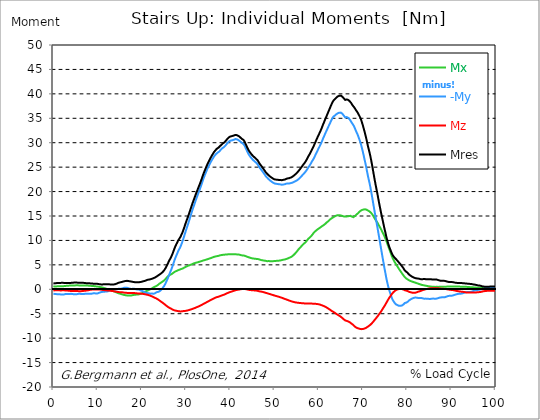
| Category |  Mx |  -My |  Mz |  Mres |
|---|---|---|---|---|
| 0.0 | 0.56 | -0.91 | -0.23 | 1.18 |
| 0.16678370786516855 | 0.56 | -0.93 | -0.23 | 1.21 |
| 0.3335674157303371 | 0.57 | -0.96 | -0.22 | 1.23 |
| 0.5003511235955057 | 0.58 | -0.97 | -0.21 | 1.25 |
| 0.6671348314606742 | 0.59 | -0.99 | -0.21 | 1.26 |
| 0.8339185393258427 | 0.6 | -1 | -0.21 | 1.27 |
| 1.0007022471910114 | 0.61 | -1 | -0.21 | 1.27 |
| 1.1674859550561796 | 0.62 | -1 | -0.22 | 1.28 |
| 1.3342696629213484 | 0.62 | -1.02 | -0.22 | 1.28 |
| 1.5010533707865168 | 0.62 | -1.04 | -0.23 | 1.3 |
| 1.6678370786516854 | 0.62 | -1.05 | -0.23 | 1.31 |
| 1.8346207865168538 | 0.62 | -1.07 | -0.23 | 1.32 |
| 2.001404494382023 | 0.63 | -1.07 | -0.22 | 1.32 |
| 2.1681882022471908 | 0.63 | -1.07 | -0.21 | 1.32 |
| 2.334971910112359 | 0.64 | -1.06 | -0.21 | 1.31 |
| 2.501755617977528 | 0.66 | -1.03 | -0.22 | 1.29 |
| 2.668539325842697 | 0.68 | -0.99 | -0.23 | 1.27 |
| 2.8353230337078656 | 0.69 | -0.97 | -0.25 | 1.27 |
| 3.0021067415730336 | 0.71 | -0.99 | -0.26 | 1.29 |
| 3.168890449438202 | 0.72 | -1 | -0.27 | 1.31 |
| 3.335674157303371 | 0.73 | -0.99 | -0.28 | 1.31 |
| 3.502457865168539 | 0.75 | -0.97 | -0.29 | 1.31 |
| 3.6692415730337076 | 0.76 | -0.96 | -0.31 | 1.31 |
| 3.8360252808988764 | 0.77 | -0.94 | -0.33 | 1.3 |
| 4.002808988764046 | 0.78 | -0.93 | -0.35 | 1.31 |
| 4.169592696629214 | 0.79 | -0.94 | -0.36 | 1.32 |
| 4.3363764044943816 | 0.79 | -0.97 | -0.36 | 1.34 |
| 4.50316011235955 | 0.8 | -1 | -0.36 | 1.36 |
| 4.669943820224718 | 0.8 | -1.02 | -0.36 | 1.37 |
| 4.836727528089888 | 0.79 | -1.03 | -0.36 | 1.38 |
| 5.003511235955056 | 0.8 | -1.03 | -0.35 | 1.38 |
| 5.170294943820225 | 0.81 | -1.02 | -0.35 | 1.38 |
| 5.337078651685394 | 0.81 | -1 | -0.36 | 1.37 |
| 5.5038623595505625 | 0.81 | -0.97 | -0.37 | 1.35 |
| 5.670646067415731 | 0.8 | -0.94 | -0.38 | 1.34 |
| 5.837429775280899 | 0.79 | -0.93 | -0.39 | 1.33 |
| 6.004213483146067 | 0.78 | -0.93 | -0.39 | 1.33 |
| 6.170997191011236 | 0.78 | -0.95 | -0.39 | 1.34 |
| 6.329002808988764 | 0.77 | -0.96 | -0.38 | 1.34 |
| 6.495786516853932 | 0.77 | -0.97 | -0.37 | 1.34 |
| 6.662570224719101 | 0.77 | -0.97 | -0.35 | 1.33 |
| 6.82935393258427 | 0.76 | -0.96 | -0.33 | 1.32 |
| 6.9961376404494375 | 0.76 | -0.95 | -0.31 | 1.3 |
| 7.162921348314607 | 0.76 | -0.92 | -0.29 | 1.28 |
| 7.329705056179775 | 0.77 | -0.9 | -0.28 | 1.26 |
| 7.496488764044945 | 0.77 | -0.89 | -0.26 | 1.26 |
| 7.663272471910113 | 0.77 | -0.9 | -0.23 | 1.26 |
| 7.830056179775281 | 0.76 | -0.9 | -0.21 | 1.25 |
| 7.996839887640449 | 0.74 | -0.9 | -0.18 | 1.24 |
| 8.16362359550562 | 0.73 | -0.9 | -0.14 | 1.22 |
| 8.330407303370787 | 0.72 | -0.91 | -0.11 | 1.21 |
| 8.497191011235955 | 0.71 | -0.91 | -0.09 | 1.21 |
| 8.663974719101123 | 0.69 | -0.9 | -0.07 | 1.2 |
| 8.830758426966291 | 0.68 | -0.85 | -0.07 | 1.18 |
| 8.99754213483146 | 0.66 | -0.83 | -0.06 | 1.15 |
| 9.16432584269663 | 0.65 | -0.82 | -0.06 | 1.14 |
| 9.331109550561798 | 0.64 | -0.83 | -0.06 | 1.14 |
| 9.497893258426966 | 0.62 | -0.85 | -0.06 | 1.14 |
| 9.664676966292134 | 0.59 | -0.85 | -0.05 | 1.13 |
| 9.831460674157304 | 0.57 | -0.85 | -0.05 | 1.13 |
| 9.998244382022472 | 0.55 | -0.84 | -0.04 | 1.11 |
| 10.16502808988764 | 0.52 | -0.78 | -0.04 | 1.08 |
| 10.331811797752808 | 0.5 | -0.72 | -0.05 | 1.05 |
| 10.498595505617978 | 0.47 | -0.66 | -0.06 | 1.03 |
| 10.665379213483147 | 0.44 | -0.61 | -0.07 | 1.01 |
| 10.832162921348315 | 0.4 | -0.57 | -0.09 | 0.99 |
| 10.998946629213483 | 0.37 | -0.54 | -0.11 | 0.98 |
| 11.165730337078653 | 0.33 | -0.51 | -0.13 | 1 |
| 11.33251404494382 | 0.29 | -0.5 | -0.15 | 1.02 |
| 11.49929775280899 | 0.24 | -0.49 | -0.17 | 1.03 |
| 11.666081460674157 | 0.21 | -0.48 | -0.19 | 1.01 |
| 11.832865168539326 | 0.15 | -0.48 | -0.2 | 1.01 |
| 11.999648876404493 | 0.1 | -0.47 | -0.22 | 1.02 |
| 12.166432584269662 | 0.04 | -0.45 | -0.23 | 1.02 |
| 12.333216292134832 | -0.01 | -0.41 | -0.24 | 1.01 |
| 12.5 | -0.05 | -0.35 | -0.25 | 1 |
| 12.66678370786517 | -0.1 | -0.29 | -0.26 | 1.01 |
| 12.833567415730336 | -0.14 | -0.22 | -0.28 | 1.02 |
| 13.000351123595506 | -0.19 | -0.17 | -0.31 | 0.99 |
| 13.167134831460674 | -0.22 | -0.14 | -0.33 | 0.97 |
| 13.333918539325843 | -0.28 | -0.11 | -0.35 | 0.98 |
| 13.500702247191011 | -0.34 | -0.1 | -0.37 | 0.98 |
| 13.667485955056181 | -0.41 | -0.07 | -0.4 | 0.99 |
| 13.834269662921349 | -0.48 | -0.05 | -0.43 | 1 |
| 14.001053370786519 | -0.54 | -0.05 | -0.46 | 1.05 |
| 14.167837078651687 | -0.61 | -0.03 | -0.48 | 1.11 |
| 14.334620786516853 | -0.67 | -0.01 | -0.51 | 1.17 |
| 14.501404494382026 | -0.73 | 0.03 | -0.53 | 1.24 |
| 14.668188202247192 | -0.79 | 0.09 | -0.56 | 1.32 |
| 14.834971910112362 | -0.83 | 0.11 | -0.58 | 1.36 |
| 15.001755617977528 | -0.88 | 0.11 | -0.59 | 1.4 |
| 15.168539325842698 | -0.92 | 0.12 | -0.6 | 1.43 |
| 15.335323033707864 | -0.98 | 0.13 | -0.6 | 1.47 |
| 15.502106741573034 | -1.03 | 0.16 | -0.61 | 1.51 |
| 15.6688904494382 | -1.07 | 0.2 | -0.63 | 1.55 |
| 15.83567415730337 | -1.12 | 0.26 | -0.66 | 1.6 |
| 16.00245786516854 | -1.16 | 0.3 | -0.68 | 1.64 |
| 16.16924157303371 | -1.19 | 0.33 | -0.7 | 1.68 |
| 16.336025280898877 | -1.21 | 0.33 | -0.72 | 1.7 |
| 16.502808988764045 | -1.25 | 0.33 | -0.73 | 1.73 |
| 16.669592696629216 | -1.27 | 0.3 | -0.74 | 1.73 |
| 16.83637640449438 | -1.28 | 0.25 | -0.75 | 1.71 |
| 17.003160112359552 | -1.28 | 0.2 | -0.75 | 1.68 |
| 17.169943820224717 | -1.28 | 0.15 | -0.75 | 1.65 |
| 17.336727528089888 | -1.29 | 0.11 | -0.75 | 1.63 |
| 17.503511235955056 | -1.28 | 0.11 | -0.75 | 1.61 |
| 17.670294943820224 | -1.25 | 0.07 | -0.74 | 1.57 |
| 17.837078651685395 | -1.22 | 0.09 | -0.74 | 1.54 |
| 18.003862359550563 | -1.18 | 0.11 | -0.75 | 1.51 |
| 18.17064606741573 | -1.16 | 0.12 | -0.76 | 1.48 |
| 18.3374297752809 | -1.14 | 0.1 | -0.77 | 1.46 |
| 18.504213483146067 | -1.11 | 0.06 | -0.79 | 1.43 |
| 18.662219101123597 | -1.1 | 0.01 | -0.81 | 1.43 |
| 18.829002808988765 | -1.09 | -0.02 | -0.83 | 1.43 |
| 18.995786516853933 | -1.07 | -0.05 | -0.84 | 1.43 |
| 19.1625702247191 | -1.07 | -0.04 | -0.86 | 1.45 |
| 19.32935393258427 | -1.04 | -0.06 | -0.87 | 1.45 |
| 19.49613764044944 | -0.98 | -0.13 | -0.87 | 1.45 |
| 19.662921348314608 | -0.93 | -0.21 | -0.88 | 1.48 |
| 19.829705056179776 | -0.87 | -0.25 | -0.9 | 1.51 |
| 19.996488764044944 | -0.81 | -0.32 | -0.91 | 1.55 |
| 20.163272471910112 | -0.75 | -0.39 | -0.93 | 1.6 |
| 20.33005617977528 | -0.68 | -0.46 | -0.95 | 1.64 |
| 20.49683988764045 | -0.6 | -0.54 | -0.98 | 1.67 |
| 20.663623595505616 | -0.51 | -0.63 | -1.01 | 1.71 |
| 20.830407303370787 | -0.43 | -0.67 | -1.04 | 1.76 |
| 20.997191011235955 | -0.38 | -0.72 | -1.07 | 1.83 |
| 21.163974719101123 | -0.32 | -0.76 | -1.1 | 1.89 |
| 21.330758426966295 | -0.26 | -0.8 | -1.14 | 1.95 |
| 21.497542134831463 | -0.18 | -0.83 | -1.18 | 1.98 |
| 21.66432584269663 | -0.11 | -0.84 | -1.23 | 2 |
| 21.8311095505618 | -0.04 | -0.85 | -1.28 | 2.02 |
| 21.997893258426966 | 0.06 | -0.9 | -1.34 | 2.06 |
| 22.164676966292134 | 0.13 | -0.88 | -1.4 | 2.1 |
| 22.331460674157306 | 0.2 | -0.87 | -1.47 | 2.16 |
| 22.498244382022467 | 0.31 | -0.9 | -1.53 | 2.23 |
| 22.66502808988764 | 0.41 | -0.92 | -1.61 | 2.29 |
| 22.831811797752806 | 0.48 | -0.88 | -1.69 | 2.35 |
| 22.99859550561798 | 0.55 | -0.8 | -1.76 | 2.42 |
| 23.165379213483146 | 0.61 | -0.7 | -1.83 | 2.49 |
| 23.332162921348313 | 0.69 | -0.6 | -1.9 | 2.6 |
| 23.49894662921348 | 0.79 | -0.55 | -1.99 | 2.71 |
| 23.665730337078653 | 0.91 | -0.54 | -2.09 | 2.82 |
| 23.83251404494382 | 1.04 | -0.51 | -2.19 | 2.93 |
| 23.999297752808985 | 1.16 | -0.41 | -2.3 | 3.02 |
| 24.166081460674157 | 1.26 | -0.28 | -2.41 | 3.12 |
| 24.332865168539325 | 1.36 | -0.14 | -2.52 | 3.23 |
| 24.499648876404496 | 1.45 | 0.02 | -2.62 | 3.35 |
| 24.666432584269664 | 1.56 | 0.2 | -2.73 | 3.49 |
| 24.833216292134832 | 1.67 | 0.41 | -2.85 | 3.65 |
| 25.0 | 1.79 | 0.62 | -2.96 | 3.82 |
| 25.16678370786517 | 1.92 | 0.87 | -3.08 | 4.02 |
| 25.33356741573034 | 2.08 | 1.16 | -3.2 | 4.28 |
| 25.500351123595504 | 2.25 | 1.48 | -3.32 | 4.55 |
| 25.66713483146067 | 2.42 | 1.82 | -3.45 | 4.85 |
| 25.833918539325843 | 2.56 | 2.16 | -3.55 | 5.15 |
| 26.00070224719101 | 2.72 | 2.56 | -3.66 | 5.5 |
| 26.16748595505618 | 2.85 | 2.93 | -3.75 | 5.81 |
| 26.334269662921347 | 2.93 | 3.32 | -3.84 | 6.11 |
| 26.50105337078652 | 2.99 | 3.68 | -3.92 | 6.39 |
| 26.667837078651687 | 3.07 | 4.04 | -4 | 6.69 |
| 26.834620786516858 | 3.18 | 4.45 | -4.08 | 7.03 |
| 27.001404494382022 | 3.29 | 4.88 | -4.16 | 7.4 |
| 27.16818820224719 | 3.41 | 5.33 | -4.24 | 7.82 |
| 27.334971910112362 | 3.52 | 5.78 | -4.3 | 8.22 |
| 27.50175561797753 | 3.6 | 6.22 | -4.35 | 8.61 |
| 27.668539325842698 | 3.68 | 6.62 | -4.38 | 8.97 |
| 27.835323033707866 | 3.75 | 6.97 | -4.41 | 9.28 |
| 28.002106741573037 | 3.81 | 7.32 | -4.43 | 9.57 |
| 28.168890449438205 | 3.88 | 7.69 | -4.46 | 9.89 |
| 28.335674157303373 | 3.95 | 8.02 | -4.49 | 10.17 |
| 28.502457865168537 | 4 | 8.29 | -4.51 | 10.39 |
| 28.669241573033705 | 4.07 | 8.57 | -4.53 | 10.63 |
| 28.836025280898877 | 4.13 | 8.92 | -4.54 | 10.93 |
| 29.002808988764052 | 4.18 | 9.33 | -4.52 | 11.26 |
| 29.169592696629213 | 4.22 | 9.73 | -4.5 | 11.58 |
| 29.336376404494384 | 4.29 | 10.19 | -4.47 | 11.99 |
| 29.50316011235955 | 4.37 | 10.66 | -4.45 | 12.41 |
| 29.669943820224724 | 4.47 | 11.14 | -4.45 | 12.86 |
| 29.836727528089884 | 4.56 | 11.63 | -4.42 | 13.32 |
| 30.003511235955056 | 4.63 | 12.11 | -4.4 | 13.76 |
| 30.170294943820224 | 4.7 | 12.57 | -4.38 | 14.18 |
| 30.337078651685395 | 4.77 | 13.01 | -4.33 | 14.58 |
| 30.503862359550563 | 4.84 | 13.48 | -4.29 | 15.02 |
| 30.670646067415728 | 4.89 | 13.97 | -4.25 | 15.46 |
| 30.837429775280903 | 4.94 | 14.46 | -4.2 | 15.91 |
| 30.99543539325843 | 5 | 14.94 | -4.15 | 16.36 |
| 31.162219101123597 | 5.07 | 15.43 | -4.11 | 16.82 |
| 31.32900280898876 | 5.13 | 15.91 | -4.06 | 17.27 |
| 31.495786516853936 | 5.19 | 16.39 | -4.01 | 17.7 |
| 31.6625702247191 | 5.26 | 16.83 | -3.94 | 18.12 |
| 31.82935393258427 | 5.33 | 17.26 | -3.88 | 18.53 |
| 31.996137640449433 | 5.38 | 17.7 | -3.83 | 18.94 |
| 32.162921348314605 | 5.42 | 18.15 | -3.76 | 19.36 |
| 32.329705056179776 | 5.45 | 18.57 | -3.7 | 19.75 |
| 32.49648876404494 | 5.48 | 18.97 | -3.64 | 20.11 |
| 32.66327247191011 | 5.53 | 19.42 | -3.57 | 20.53 |
| 32.83005617977528 | 5.59 | 19.8 | -3.52 | 20.9 |
| 32.996839887640455 | 5.63 | 20.19 | -3.45 | 21.28 |
| 33.16362359550562 | 5.67 | 20.6 | -3.37 | 21.67 |
| 33.330407303370784 | 5.72 | 21.04 | -3.28 | 22.09 |
| 33.497191011235955 | 5.77 | 21.46 | -3.2 | 22.49 |
| 33.66397471910113 | 5.82 | 21.91 | -3.13 | 22.92 |
| 33.83075842696629 | 5.87 | 22.38 | -3.05 | 23.37 |
| 33.997542134831455 | 5.92 | 22.81 | -2.97 | 23.78 |
| 34.164325842696634 | 5.97 | 23.2 | -2.89 | 24.16 |
| 34.3311095505618 | 6.01 | 23.58 | -2.81 | 24.53 |
| 34.49789325842697 | 6.06 | 23.94 | -2.72 | 24.88 |
| 34.66467696629213 | 6.1 | 24.32 | -2.64 | 25.25 |
| 34.831460674157306 | 6.15 | 24.69 | -2.56 | 25.61 |
| 34.99824438202247 | 6.2 | 25.02 | -2.48 | 25.94 |
| 35.16502808988764 | 6.26 | 25.31 | -2.4 | 26.22 |
| 35.331811797752806 | 6.31 | 25.61 | -2.32 | 26.52 |
| 35.49859550561798 | 6.35 | 25.91 | -2.24 | 26.81 |
| 35.66537921348315 | 6.4 | 26.18 | -2.16 | 27.09 |
| 35.83216292134831 | 6.47 | 26.46 | -2.08 | 27.36 |
| 35.998946629213485 | 6.53 | 26.71 | -2 | 27.61 |
| 36.16573033707865 | 6.59 | 26.94 | -1.93 | 27.85 |
| 36.33251404494382 | 6.64 | 27.19 | -1.85 | 28.1 |
| 36.499297752808985 | 6.68 | 27.4 | -1.78 | 28.3 |
| 36.666081460674164 | 6.72 | 27.57 | -1.7 | 28.47 |
| 36.83286516853932 | 6.75 | 27.73 | -1.64 | 28.63 |
| 36.99964887640449 | 6.78 | 27.89 | -1.6 | 28.8 |
| 37.166432584269664 | 6.81 | 27.99 | -1.56 | 28.9 |
| 37.333216292134836 | 6.84 | 28.08 | -1.52 | 28.99 |
| 37.5 | 6.89 | 28.19 | -1.47 | 29.11 |
| 37.666783707865164 | 6.94 | 28.38 | -1.4 | 29.3 |
| 37.833567415730336 | 6.98 | 28.55 | -1.34 | 29.47 |
| 38.00035112359551 | 7.01 | 28.67 | -1.29 | 29.58 |
| 38.16713483146068 | 7.03 | 28.86 | -1.23 | 29.77 |
| 38.333918539325836 | 7.05 | 28.96 | -1.18 | 29.87 |
| 38.50070224719101 | 7.07 | 29.05 | -1.13 | 29.95 |
| 38.66748595505618 | 7.08 | 29.16 | -1.07 | 30.06 |
| 38.83426966292135 | 7.1 | 29.34 | -1 | 30.24 |
| 39.001053370786515 | 7.12 | 29.51 | -0.93 | 30.41 |
| 39.16783707865169 | 7.13 | 29.71 | -0.86 | 30.6 |
| 39.33462078651686 | 7.14 | 29.88 | -0.79 | 30.77 |
| 39.50140449438202 | 7.16 | 30.08 | -0.73 | 30.96 |
| 39.668188202247194 | 7.17 | 30.22 | -0.66 | 31.09 |
| 39.83497191011236 | 7.17 | 30.33 | -0.6 | 31.2 |
| 40.00175561797753 | 7.18 | 30.4 | -0.55 | 31.27 |
| 40.168539325842694 | 7.19 | 30.45 | -0.5 | 31.32 |
| 40.335323033707866 | 7.18 | 30.47 | -0.46 | 31.34 |
| 40.50210674157304 | 7.18 | 30.51 | -0.41 | 31.37 |
| 40.6688904494382 | 7.18 | 30.57 | -0.35 | 31.43 |
| 40.83567415730337 | 7.17 | 30.62 | -0.3 | 31.48 |
| 41.00245786516854 | 7.17 | 30.7 | -0.24 | 31.55 |
| 41.16924157303371 | 7.16 | 30.75 | -0.19 | 31.61 |
| 41.33602528089887 | 7.15 | 30.73 | -0.16 | 31.59 |
| 41.502808988764045 | 7.14 | 30.69 | -0.13 | 31.54 |
| 41.669592696629216 | 7.13 | 30.62 | -0.1 | 31.47 |
| 41.83637640449439 | 7.11 | 30.54 | -0.08 | 31.39 |
| 42.00316011235955 | 7.1 | 30.46 | -0.05 | 31.31 |
| 42.16994382022472 | 7.05 | 30.31 | -0.02 | 31.15 |
| 42.33672752808989 | 7.01 | 30.19 | 0.01 | 31.02 |
| 42.50351123595506 | 6.98 | 30.06 | 0.03 | 30.89 |
| 42.670294943820224 | 6.94 | 29.94 | 0.05 | 30.76 |
| 42.83707865168539 | 6.94 | 29.85 | 0.07 | 30.67 |
| 43.00386235955057 | 6.93 | 29.73 | 0.08 | 30.56 |
| 43.17064606741573 | 6.9 | 29.5 | 0.07 | 30.32 |
| 43.32865168539326 | 6.84 | 29.2 | 0.06 | 30.02 |
| 43.495435393258425 | 6.78 | 28.88 | 0.03 | 29.69 |
| 43.6622191011236 | 6.72 | 28.55 | 0 | 29.37 |
| 43.82900280898876 | 6.66 | 28.22 | -0.03 | 29.04 |
| 43.99578651685393 | 6.6 | 27.9 | -0.07 | 28.72 |
| 44.162570224719104 | 6.55 | 27.6 | -0.11 | 28.42 |
| 44.32935393258427 | 6.5 | 27.38 | -0.14 | 28.2 |
| 44.49613764044944 | 6.45 | 27.16 | -0.16 | 27.97 |
| 44.66292134831461 | 6.4 | 26.98 | -0.17 | 27.79 |
| 44.82970505617978 | 6.35 | 26.79 | -0.19 | 27.59 |
| 44.99648876404493 | 6.32 | 26.62 | -0.2 | 27.42 |
| 45.16327247191011 | 6.3 | 26.45 | -0.21 | 27.26 |
| 45.33005617977528 | 6.28 | 26.31 | -0.22 | 27.12 |
| 45.49683988764045 | 6.26 | 26.18 | -0.23 | 26.99 |
| 45.66362359550561 | 6.25 | 26.06 | -0.25 | 26.86 |
| 45.83040730337079 | 6.23 | 25.92 | -0.27 | 26.72 |
| 45.99719101123596 | 6.2 | 25.78 | -0.28 | 26.59 |
| 46.16397471910113 | 6.2 | 25.61 | -0.31 | 26.42 |
| 46.33075842696629 | 6.17 | 25.36 | -0.36 | 26.17 |
| 46.497542134831455 | 6.11 | 25.11 | -0.39 | 25.91 |
| 46.66432584269663 | 6.08 | 24.86 | -0.43 | 25.67 |
| 46.83110955056179 | 6.03 | 24.68 | -0.45 | 25.47 |
| 46.99789325842696 | 5.98 | 24.48 | -0.47 | 25.27 |
| 47.164676966292134 | 5.94 | 24.29 | -0.5 | 25.07 |
| 47.331460674157306 | 5.92 | 24.07 | -0.54 | 24.86 |
| 47.49824438202247 | 5.9 | 23.85 | -0.58 | 24.64 |
| 47.66502808988764 | 5.87 | 23.65 | -0.62 | 24.44 |
| 47.83181179775281 | 5.85 | 23.43 | -0.67 | 24.22 |
| 47.99859550561797 | 5.82 | 23.18 | -0.73 | 23.97 |
| 48.16537921348314 | 5.78 | 22.99 | -0.77 | 23.79 |
| 48.33216292134831 | 5.75 | 22.85 | -0.8 | 23.64 |
| 48.498946629213485 | 5.76 | 22.68 | -0.85 | 23.48 |
| 48.66573033707865 | 5.78 | 22.53 | -0.91 | 23.34 |
| 48.83251404494382 | 5.77 | 22.4 | -0.95 | 23.21 |
| 48.99929775280899 | 5.75 | 22.27 | -0.99 | 23.08 |
| 49.166081460674164 | 5.75 | 22.17 | -1.04 | 22.98 |
| 49.33286516853933 | 5.76 | 22.04 | -1.09 | 22.86 |
| 49.499648876404486 | 5.76 | 21.93 | -1.14 | 22.76 |
| 49.666432584269664 | 5.76 | 21.83 | -1.18 | 22.66 |
| 49.83321629213483 | 5.75 | 21.74 | -1.23 | 22.57 |
| 50.0 | 5.77 | 21.66 | -1.28 | 22.5 |
| 50.166783707865164 | 5.79 | 21.63 | -1.32 | 22.47 |
| 50.33356741573034 | 5.81 | 21.6 | -1.37 | 22.45 |
| 50.50035112359551 | 5.83 | 21.57 | -1.41 | 22.43 |
| 50.66713483146068 | 5.83 | 21.55 | -1.45 | 22.42 |
| 50.83391853932584 | 5.85 | 21.53 | -1.49 | 22.4 |
| 51.00070224719101 | 5.86 | 21.51 | -1.54 | 22.38 |
| 51.16748595505618 | 5.88 | 21.49 | -1.59 | 22.38 |
| 51.33426966292134 | 5.91 | 21.47 | -1.64 | 22.37 |
| 51.50105337078652 | 5.94 | 21.43 | -1.69 | 22.34 |
| 51.66783707865169 | 5.98 | 21.4 | -1.74 | 22.33 |
| 51.83462078651686 | 6.02 | 21.42 | -1.8 | 22.36 |
| 52.00140449438202 | 6.06 | 21.45 | -1.85 | 22.4 |
| 52.168188202247194 | 6.08 | 21.47 | -1.92 | 22.42 |
| 52.33497191011236 | 6.1 | 21.5 | -1.98 | 22.46 |
| 52.50175561797752 | 6.15 | 21.56 | -2.03 | 22.53 |
| 52.668539325842694 | 6.2 | 21.62 | -2.08 | 22.61 |
| 52.835323033707866 | 6.25 | 21.66 | -2.13 | 22.67 |
| 53.00210674157304 | 6.31 | 21.67 | -2.19 | 22.7 |
| 53.1688904494382 | 6.37 | 21.68 | -2.25 | 22.73 |
| 53.33567415730337 | 6.45 | 21.66 | -2.31 | 22.75 |
| 53.502457865168545 | 6.51 | 21.7 | -2.36 | 22.81 |
| 53.669241573033716 | 6.58 | 21.73 | -2.41 | 22.86 |
| 53.83602528089887 | 6.65 | 21.77 | -2.46 | 22.93 |
| 54.002808988764045 | 6.75 | 21.81 | -2.51 | 23.01 |
| 54.169592696629216 | 6.86 | 21.88 | -2.56 | 23.11 |
| 54.33637640449438 | 7.02 | 21.96 | -2.6 | 23.24 |
| 54.50316011235955 | 7.16 | 22.03 | -2.64 | 23.37 |
| 54.669943820224724 | 7.32 | 22.11 | -2.67 | 23.49 |
| 54.836727528089895 | 7.49 | 22.18 | -2.7 | 23.62 |
| 55.00351123595506 | 7.67 | 22.25 | -2.72 | 23.76 |
| 55.17029494382022 | 7.87 | 22.36 | -2.74 | 23.93 |
| 55.337078651685395 | 8.07 | 22.47 | -2.76 | 24.11 |
| 55.50386235955056 | 8.23 | 22.59 | -2.78 | 24.28 |
| 55.66186797752809 | 8.41 | 22.72 | -2.8 | 24.47 |
| 55.82865168539326 | 8.57 | 22.88 | -2.82 | 24.67 |
| 55.995435393258425 | 8.73 | 23.05 | -2.83 | 24.88 |
| 56.1622191011236 | 8.9 | 23.21 | -2.85 | 25.09 |
| 56.32900280898877 | 9.06 | 23.38 | -2.86 | 25.3 |
| 56.49578651685393 | 9.21 | 23.54 | -2.87 | 25.51 |
| 56.6625702247191 | 9.35 | 23.7 | -2.88 | 25.7 |
| 56.82935393258427 | 9.48 | 23.86 | -2.9 | 25.89 |
| 56.99613764044943 | 9.61 | 24.05 | -2.92 | 26.12 |
| 57.16292134831461 | 9.78 | 24.25 | -2.93 | 26.37 |
| 57.329705056179776 | 9.97 | 24.48 | -2.93 | 26.64 |
| 57.49648876404495 | 10.14 | 24.72 | -2.93 | 26.93 |
| 57.66327247191011 | 10.36 | 24.96 | -2.93 | 27.23 |
| 57.83005617977529 | 10.5 | 25.18 | -2.92 | 27.48 |
| 57.99683988764044 | 10.61 | 25.42 | -2.9 | 27.74 |
| 58.16362359550561 | 10.74 | 25.67 | -2.9 | 28.02 |
| 58.33040730337079 | 10.91 | 25.94 | -2.91 | 28.33 |
| 58.497191011235955 | 11.09 | 26.22 | -2.92 | 28.66 |
| 58.66397471910112 | 11.31 | 26.45 | -2.95 | 28.95 |
| 58.83075842696629 | 11.52 | 26.7 | -2.98 | 29.26 |
| 58.99754213483147 | 11.67 | 27.01 | -2.98 | 29.6 |
| 59.164325842696634 | 11.83 | 27.32 | -2.98 | 29.95 |
| 59.33110955056179 | 11.96 | 27.64 | -2.98 | 30.3 |
| 59.49789325842697 | 12.09 | 27.96 | -2.99 | 30.64 |
| 59.664676966292134 | 12.22 | 28.26 | -3.02 | 30.98 |
| 59.8314606741573 | 12.33 | 28.58 | -3.05 | 31.32 |
| 59.99824438202247 | 12.42 | 28.89 | -3.07 | 31.63 |
| 60.16502808988765 | 12.53 | 29.18 | -3.11 | 31.95 |
| 60.33181179775281 | 12.65 | 29.49 | -3.15 | 32.28 |
| 60.49859550561798 | 12.75 | 29.8 | -3.2 | 32.61 |
| 60.66537921348315 | 12.85 | 30.15 | -3.26 | 32.98 |
| 60.83216292134831 | 12.97 | 30.53 | -3.32 | 33.38 |
| 60.99894662921348 | 13.08 | 30.9 | -3.38 | 33.76 |
| 61.16573033707864 | 13.17 | 31.24 | -3.43 | 34.12 |
| 61.33251404494383 | 13.29 | 31.59 | -3.5 | 34.49 |
| 61.49929775280899 | 13.41 | 31.95 | -3.58 | 34.87 |
| 61.66608146067416 | 13.56 | 32.26 | -3.67 | 35.22 |
| 61.83286516853932 | 13.71 | 32.58 | -3.76 | 35.58 |
| 61.99964887640451 | 13.83 | 32.93 | -3.85 | 35.95 |
| 62.16643258426967 | 13.93 | 33.26 | -3.93 | 36.3 |
| 62.33321629213482 | 14.08 | 33.57 | -4.04 | 36.66 |
| 62.5 | 14.24 | 33.89 | -4.15 | 37.02 |
| 62.66678370786517 | 14.36 | 34.23 | -4.26 | 37.39 |
| 62.833567415730336 | 14.48 | 34.54 | -4.37 | 37.73 |
| 63.0003511235955 | 14.58 | 34.86 | -4.47 | 38.08 |
| 63.16713483146068 | 14.67 | 35.13 | -4.55 | 38.37 |
| 63.33391853932585 | 14.76 | 35.35 | -4.64 | 38.62 |
| 63.500702247191015 | 14.86 | 35.49 | -4.74 | 38.8 |
| 63.66748595505618 | 14.95 | 35.57 | -4.84 | 38.92 |
| 63.83426966292135 | 15.02 | 35.72 | -4.95 | 39.1 |
| 64.00105337078651 | 15.09 | 35.84 | -5.05 | 39.25 |
| 64.16783707865169 | 15.14 | 35.94 | -5.14 | 39.37 |
| 64.33462078651687 | 15.16 | 36.04 | -5.24 | 39.49 |
| 64.50140449438203 | 15.16 | 36.13 | -5.33 | 39.58 |
| 64.6681882022472 | 15.16 | 36.15 | -5.43 | 39.62 |
| 64.83497191011236 | 15.14 | 36.15 | -5.54 | 39.63 |
| 65.00175561797754 | 15.12 | 36.16 | -5.63 | 39.64 |
| 65.16853932584269 | 15.06 | 36.08 | -5.75 | 39.56 |
| 65.33532303370787 | 15 | 35.94 | -5.88 | 39.43 |
| 65.50210674157304 | 14.96 | 35.74 | -6.02 | 39.26 |
| 65.66889044943821 | 14.9 | 35.55 | -6.15 | 39.08 |
| 65.83567415730337 | 14.88 | 35.35 | -6.27 | 38.91 |
| 66.00245786516854 | 14.86 | 35.17 | -6.38 | 38.76 |
| 66.1692415730337 | 14.88 | 35.2 | -6.43 | 38.8 |
| 66.33602528089888 | 14.91 | 35.25 | -6.47 | 38.86 |
| 66.50280898876404 | 14.93 | 35.21 | -6.52 | 38.85 |
| 66.66959269662921 | 14.96 | 35.1 | -6.58 | 38.76 |
| 66.83637640449439 | 14.98 | 34.95 | -6.64 | 38.64 |
| 67.00316011235955 | 14.98 | 34.77 | -6.73 | 38.49 |
| 67.16994382022472 | 15.04 | 34.53 | -6.85 | 38.32 |
| 67.33672752808988 | 15.06 | 34.29 | -6.98 | 38.14 |
| 67.50351123595506 | 14.88 | 34.06 | -7.07 | 37.87 |
| 67.67029494382022 | 14.78 | 33.83 | -7.2 | 37.64 |
| 67.83707865168539 | 14.76 | 33.59 | -7.34 | 37.45 |
| 67.99508426966291 | 14.86 | 33.32 | -7.48 | 37.27 |
| 68.16186797752809 | 14.99 | 32.97 | -7.63 | 37.05 |
| 68.32865168539327 | 15.13 | 32.6 | -7.75 | 36.8 |
| 68.49543539325843 | 15.26 | 32.24 | -7.84 | 36.56 |
| 68.6622191011236 | 15.38 | 31.93 | -7.92 | 36.35 |
| 68.82900280898876 | 15.53 | 31.57 | -7.97 | 36.11 |
| 68.99578651685394 | 15.69 | 31.15 | -8.02 | 35.83 |
| 69.1625702247191 | 15.84 | 30.74 | -8.06 | 35.54 |
| 69.32935393258425 | 15.97 | 30.31 | -8.11 | 35.24 |
| 69.49613764044945 | 16.09 | 29.84 | -8.15 | 34.9 |
| 69.66292134831461 | 16.18 | 29.28 | -8.16 | 34.47 |
| 69.82970505617978 | 16.24 | 28.67 | -8.15 | 33.98 |
| 69.99648876404494 | 16.3 | 28.04 | -8.13 | 33.48 |
| 70.16327247191012 | 16.34 | 27.38 | -8.1 | 32.93 |
| 70.33005617977528 | 16.37 | 26.69 | -8.04 | 32.37 |
| 70.49683988764045 | 16.37 | 26.02 | -7.98 | 31.8 |
| 70.66362359550561 | 16.34 | 25.31 | -7.91 | 31.19 |
| 70.83040730337079 | 16.28 | 24.56 | -7.82 | 30.53 |
| 70.99719101123596 | 16.19 | 23.78 | -7.71 | 29.83 |
| 71.16397471910112 | 16.11 | 23.04 | -7.6 | 29.16 |
| 71.3307584269663 | 16.02 | 22.36 | -7.5 | 28.55 |
| 71.49754213483146 | 15.92 | 21.69 | -7.39 | 27.95 |
| 71.66432584269663 | 15.81 | 20.95 | -7.27 | 27.28 |
| 71.83110955056179 | 15.65 | 20.15 | -7.13 | 26.54 |
| 71.99789325842697 | 15.47 | 19.3 | -6.98 | 25.75 |
| 72.16467696629215 | 15.26 | 18.4 | -6.81 | 24.91 |
| 72.3314606741573 | 15.01 | 17.52 | -6.63 | 24.05 |
| 72.49824438202248 | 14.74 | 16.63 | -6.44 | 23.18 |
| 72.66502808988764 | 14.49 | 15.75 | -6.25 | 22.34 |
| 72.8318117977528 | 14.25 | 14.89 | -6.07 | 21.54 |
| 72.99859550561797 | 14.01 | 14.04 | -5.88 | 20.75 |
| 73.16537921348315 | 13.79 | 13.21 | -5.7 | 20.02 |
| 73.33216292134833 | 13.54 | 12.36 | -5.5 | 19.22 |
| 73.49894662921349 | 13.25 | 11.49 | -5.29 | 18.4 |
| 73.66573033707864 | 12.98 | 10.61 | -5.09 | 17.61 |
| 73.83251404494382 | 12.71 | 9.72 | -4.88 | 16.84 |
| 73.99929775280899 | 12.44 | 8.82 | -4.67 | 16.08 |
| 74.16608146067415 | 12.16 | 7.94 | -4.45 | 15.34 |
| 74.33286516853933 | 11.85 | 7.06 | -4.19 | 14.65 |
| 74.49964887640449 | 11.53 | 6.19 | -3.95 | 13.95 |
| 74.66643258426967 | 11.22 | 5.34 | -3.72 | 13.25 |
| 74.83321629213484 | 10.9 | 4.46 | -3.49 | 12.54 |
| 75.0 | 10.54 | 3.67 | -3.23 | 11.91 |
| 75.16678370786516 | 10.17 | 2.86 | -2.97 | 11.25 |
| 75.33356741573033 | 9.78 | 2.06 | -2.69 | 10.58 |
| 75.5003511235955 | 9.38 | 1.4 | -2.44 | 10.04 |
| 75.66713483146067 | 8.94 | 0.73 | -2.16 | 9.48 |
| 75.83391853932585 | 8.52 | 0.17 | -1.91 | 8.99 |
| 76.00070224719101 | 8.11 | -0.34 | -1.68 | 8.54 |
| 76.16748595505618 | 7.72 | -0.79 | -1.46 | 8.18 |
| 76.33426966292136 | 7.29 | -1.26 | -1.24 | 7.79 |
| 76.50105337078652 | 6.86 | -1.7 | -1.01 | 7.4 |
| 76.66783707865167 | 6.5 | -2.05 | -0.82 | 7.11 |
| 76.83462078651685 | 6.17 | -2.34 | -0.65 | 6.84 |
| 77.00140449438202 | 5.89 | -2.56 | -0.51 | 6.66 |
| 77.1681882022472 | 5.59 | -2.8 | -0.36 | 6.46 |
| 77.33497191011236 | 5.34 | -2.97 | -0.24 | 6.31 |
| 77.50175561797754 | 5.09 | -3.11 | -0.15 | 6.15 |
| 77.6685393258427 | 4.85 | -3.19 | -0.07 | 5.98 |
| 77.83532303370787 | 4.61 | -3.26 | -0.01 | 5.8 |
| 78.00210674157303 | 4.36 | -3.33 | 0.02 | 5.62 |
| 78.1688904494382 | 4.13 | -3.39 | 0.05 | 5.45 |
| 78.33567415730337 | 3.91 | -3.41 | 0.07 | 5.27 |
| 78.50245786516854 | 3.69 | -3.39 | 0.08 | 5.09 |
| 78.66924157303372 | 3.48 | -3.35 | 0.07 | 4.91 |
| 78.83602528089888 | 3.25 | -3.31 | 0.04 | 4.72 |
| 79.00280898876404 | 3.06 | -3.22 | 0.01 | 4.52 |
| 79.16959269662921 | 2.84 | -3.09 | -0.05 | 4.29 |
| 79.33637640449439 | 2.63 | -2.91 | -0.14 | 4.02 |
| 79.50316011235955 | 2.47 | -2.79 | -0.21 | 3.82 |
| 79.66994382022472 | 2.31 | -2.75 | -0.24 | 3.67 |
| 79.8367275280899 | 2.18 | -2.73 | -0.28 | 3.57 |
| 80.00351123595506 | 2.08 | -2.66 | -0.32 | 3.45 |
| 80.17029494382022 | 1.98 | -2.52 | -0.39 | 3.28 |
| 80.32830056179776 | 1.89 | -2.37 | -0.47 | 3.11 |
| 80.49508426966293 | 1.8 | -2.23 | -0.54 | 2.96 |
| 80.66186797752809 | 1.73 | -2.12 | -0.59 | 2.84 |
| 80.82865168539325 | 1.67 | -2.04 | -0.62 | 2.74 |
| 80.99543539325842 | 1.61 | -1.95 | -0.66 | 2.64 |
| 81.1622191011236 | 1.56 | -1.87 | -0.69 | 2.55 |
| 81.32900280898878 | 1.51 | -1.81 | -0.71 | 2.48 |
| 81.49578651685394 | 1.46 | -1.76 | -0.71 | 2.41 |
| 81.6625702247191 | 1.41 | -1.71 | -0.72 | 2.34 |
| 81.82935393258427 | 1.36 | -1.68 | -0.71 | 2.29 |
| 81.99613764044945 | 1.31 | -1.69 | -0.66 | 2.25 |
| 82.16292134831461 | 1.26 | -1.72 | -0.61 | 2.23 |
| 82.32970505617978 | 1.2 | -1.76 | -0.55 | 2.21 |
| 82.49648876404494 | 1.14 | -1.78 | -0.49 | 2.19 |
| 82.66327247191012 | 1.09 | -1.79 | -0.44 | 2.17 |
| 82.83005617977528 | 1.04 | -1.78 | -0.4 | 2.12 |
| 82.99683988764045 | 0.99 | -1.77 | -0.35 | 2.08 |
| 83.16362359550563 | 0.94 | -1.78 | -0.3 | 2.05 |
| 83.33040730337079 | 0.89 | -1.81 | -0.24 | 2.05 |
| 83.49719101123596 | 0.86 | -1.85 | -0.17 | 2.07 |
| 83.66397471910112 | 0.83 | -1.89 | -0.12 | 2.09 |
| 83.8307584269663 | 0.8 | -1.92 | -0.08 | 2.1 |
| 83.99754213483146 | 0.77 | -1.92 | -0.03 | 2.09 |
| 84.16432584269663 | 0.74 | -1.91 | 0.01 | 2.06 |
| 84.33110955056179 | 0.71 | -1.92 | 0.04 | 2.06 |
| 84.49789325842697 | 0.68 | -1.93 | 0.07 | 2.05 |
| 84.66467696629213 | 0.65 | -1.94 | 0.1 | 2.05 |
| 84.8314606741573 | 0.62 | -1.96 | 0.13 | 2.06 |
| 84.99824438202248 | 0.6 | -1.97 | 0.16 | 2.07 |
| 85.16502808988764 | 0.58 | -1.98 | 0.19 | 2.07 |
| 85.3318117977528 | 0.56 | -1.97 | 0.21 | 2.06 |
| 85.49859550561797 | 0.54 | -1.94 | 0.21 | 2.03 |
| 85.66537921348315 | 0.53 | -1.91 | 0.21 | 2 |
| 85.83216292134831 | 0.51 | -1.9 | 0.21 | 1.98 |
| 85.99894662921348 | 0.5 | -1.9 | 0.21 | 1.98 |
| 86.16573033707866 | 0.49 | -1.92 | 0.21 | 1.99 |
| 86.33251404494384 | 0.49 | -1.92 | 0.21 | 2 |
| 86.499297752809 | 0.5 | -1.93 | 0.22 | 2.01 |
| 86.66608146067415 | 0.5 | -1.91 | 0.22 | 1.99 |
| 86.83286516853933 | 0.49 | -1.86 | 0.21 | 1.94 |
| 86.99964887640449 | 0.49 | -1.81 | 0.2 | 1.89 |
| 87.16643258426966 | 0.49 | -1.76 | 0.18 | 1.84 |
| 87.33321629213482 | 0.5 | -1.7 | 0.16 | 1.79 |
| 87.5 | 0.5 | -1.67 | 0.14 | 1.76 |
| 87.66678370786518 | 0.5 | -1.64 | 0.12 | 1.74 |
| 87.83356741573033 | 0.5 | -1.65 | 0.11 | 1.74 |
| 88.00035112359551 | 0.5 | -1.65 | 0.1 | 1.74 |
| 88.16713483146067 | 0.5 | -1.65 | 0.09 | 1.75 |
| 88.33391853932584 | 0.5 | -1.64 | 0.08 | 1.74 |
| 88.500702247191 | 0.52 | -1.62 | 0.07 | 1.72 |
| 88.66748595505618 | 0.53 | -1.57 | 0.05 | 1.68 |
| 88.83426966292136 | 0.54 | -1.52 | 0.04 | 1.64 |
| 89.00105337078652 | 0.55 | -1.46 | 0.01 | 1.59 |
| 89.16783707865169 | 0.56 | -1.41 | -0.02 | 1.55 |
| 89.33462078651687 | 0.56 | -1.36 | -0.05 | 1.51 |
| 89.50140449438203 | 0.56 | -1.34 | -0.07 | 1.49 |
| 89.6681882022472 | 0.55 | -1.34 | -0.1 | 1.49 |
| 89.83497191011236 | 0.55 | -1.33 | -0.12 | 1.49 |
| 90.00175561797754 | 0.55 | -1.31 | -0.14 | 1.48 |
| 90.16853932584269 | 0.55 | -1.3 | -0.15 | 1.47 |
| 90.33532303370787 | 0.55 | -1.26 | -0.17 | 1.46 |
| 90.50210674157303 | 0.56 | -1.22 | -0.19 | 1.43 |
| 90.6688904494382 | 0.57 | -1.16 | -0.22 | 1.39 |
| 90.83567415730336 | 0.57 | -1.11 | -0.26 | 1.35 |
| 91.00245786516854 | 0.58 | -1.06 | -0.3 | 1.33 |
| 91.1692415730337 | 0.58 | -1.01 | -0.33 | 1.31 |
| 91.33602528089888 | 0.58 | -0.97 | -0.37 | 1.3 |
| 91.50280898876404 | 0.57 | -0.95 | -0.4 | 1.3 |
| 91.66959269662922 | 0.56 | -0.94 | -0.43 | 1.3 |
| 91.83637640449439 | 0.55 | -0.92 | -0.44 | 1.29 |
| 92.00316011235955 | 0.54 | -0.91 | -0.46 | 1.28 |
| 92.16994382022472 | 0.53 | -0.9 | -0.48 | 1.28 |
| 92.3367275280899 | 0.53 | -0.88 | -0.49 | 1.27 |
| 92.50351123595506 | 0.54 | -0.83 | -0.51 | 1.25 |
| 92.66151685393258 | 0.54 | -0.78 | -0.53 | 1.24 |
| 92.82830056179776 | 0.54 | -0.73 | -0.55 | 1.23 |
| 92.99508426966291 | 0.54 | -0.68 | -0.57 | 1.21 |
| 93.16186797752809 | 0.52 | -0.63 | -0.62 | 1.19 |
| 93.32865168539325 | 0.51 | -0.59 | -0.65 | 1.18 |
| 93.49543539325842 | 0.5 | -0.56 | -0.66 | 1.17 |
| 93.66221910112358 | 0.47 | -0.56 | -0.67 | 1.15 |
| 93.82900280898876 | 0.45 | -0.57 | -0.67 | 1.13 |
| 93.99578651685393 | 0.45 | -0.57 | -0.67 | 1.12 |
| 94.1625702247191 | 0.44 | -0.56 | -0.67 | 1.1 |
| 94.32935393258427 | 0.43 | -0.54 | -0.66 | 1.09 |
| 94.49613764044945 | 0.43 | -0.5 | -0.66 | 1.07 |
| 94.66292134831461 | 0.43 | -0.46 | -0.65 | 1.05 |
| 94.82970505617978 | 0.41 | -0.4 | -0.65 | 1.02 |
| 94.99648876404494 | 0.39 | -0.32 | -0.66 | 0.99 |
| 95.16327247191012 | 0.38 | -0.27 | -0.65 | 0.96 |
| 95.33005617977528 | 0.37 | -0.24 | -0.65 | 0.94 |
| 95.49683988764046 | 0.36 | -0.21 | -0.65 | 0.92 |
| 95.66362359550563 | 0.34 | -0.17 | -0.64 | 0.88 |
| 95.83040730337078 | 0.33 | -0.16 | -0.62 | 0.83 |
| 95.99719101123594 | 0.32 | -0.15 | -0.6 | 0.79 |
| 96.16397471910112 | 0.31 | -0.1 | -0.59 | 0.78 |
| 96.33075842696628 | 0.3 | -0.06 | -0.58 | 0.77 |
| 96.49754213483145 | 0.28 | -0.04 | -0.56 | 0.74 |
| 96.66432584269663 | 0.26 | -0.04 | -0.54 | 0.71 |
| 96.8311095505618 | 0.25 | 0 | -0.51 | 0.65 |
| 96.99789325842697 | 0.24 | 0.06 | -0.45 | 0.59 |
| 97.16467696629213 | 0.24 | 0.1 | -0.42 | 0.56 |
| 97.3314606741573 | 0.24 | 0.14 | -0.39 | 0.55 |
| 97.49824438202248 | 0.23 | 0.15 | -0.37 | 0.53 |
| 97.66502808988764 | 0.22 | 0.18 | -0.35 | 0.52 |
| 97.8318117977528 | 0.21 | 0.21 | -0.33 | 0.52 |
| 97.99859550561798 | 0.2 | 0.21 | -0.32 | 0.51 |
| 98.16537921348316 | 0.18 | 0.22 | -0.32 | 0.5 |
| 98.33216292134833 | 0.17 | 0.25 | -0.31 | 0.5 |
| 98.49894662921349 | 0.17 | 0.3 | -0.3 | 0.51 |
| 98.66573033707866 | 0.17 | 0.34 | -0.3 | 0.55 |
| 98.8325140449438 | 0.17 | 0.38 | -0.3 | 0.58 |
| 98.99929775280897 | 0.17 | 0.41 | -0.3 | 0.59 |
| 99.16608146067416 | 0.17 | 0.4 | -0.3 | 0.58 |
| 99.33286516853933 | 0.17 | 0.4 | -0.3 | 0.58 |
| 99.49964887640449 | 0.16 | 0.39 | -0.3 | 0.57 |
| 99.66643258426966 | 0.15 | 0.39 | -0.3 | 0.56 |
| 99.83321629213484 | 0.15 | 0.35 | -0.29 | 0.54 |
| 100.0 | 0.15 | 0.32 | -0.28 | 0.5 |